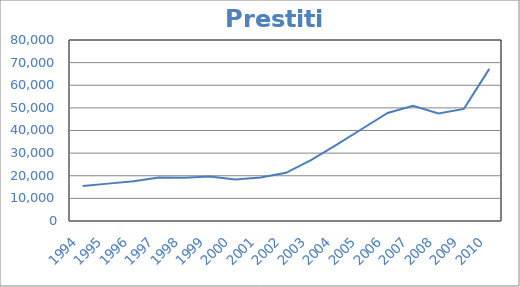
| Category | Prestiti (n.) |
|---|---|
| 1994.0 | 15465 |
| 1995.0 | 16518 |
| 1996.0 | 17586 |
| 1997.0 | 19227 |
| 1998.0 | 19146 |
| 1999.0 | 19676 |
| 2000.0 | 18336 |
| 2001.0 | 19213 |
| 2002.0 | 21302 |
| 2003.0 | 27054 |
| 2004.0 | 33719 |
| 2005.0 | 40780 |
| 2006.0 | 47727 |
| 2007.0 | 50959 |
| 2008.0 | 47538 |
| 2009.0 | 49564 |
| 2010.0 | 67244 |